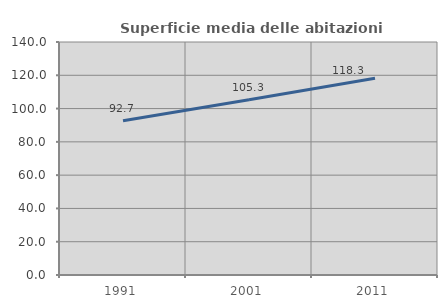
| Category | Superficie media delle abitazioni occupate |
|---|---|
| 1991.0 | 92.704 |
| 2001.0 | 105.281 |
| 2011.0 | 118.28 |